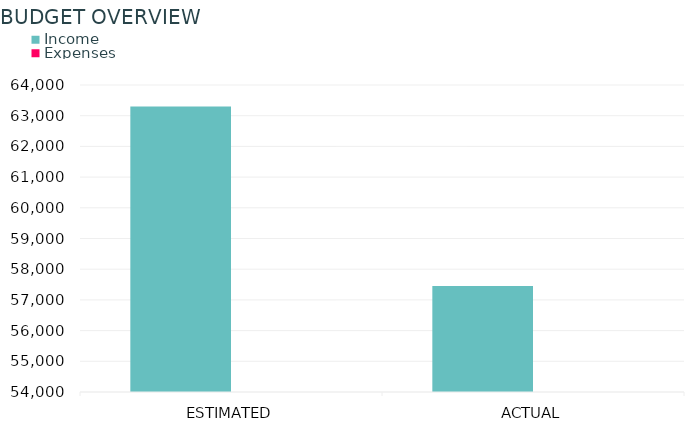
| Category | Income | Expenses |
|---|---|---|
| ESTIMATED | 63300 |  |
| ACTUAL | 57450 |  |